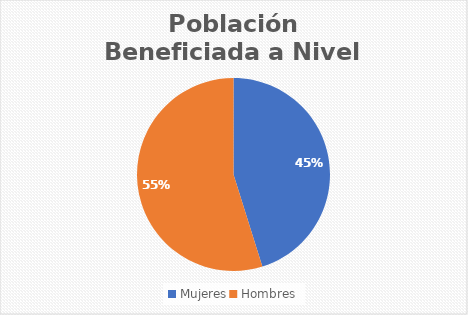
| Category | Series 0 |
|---|---|
| Mujeres | 243 |
| Hombres | 295 |